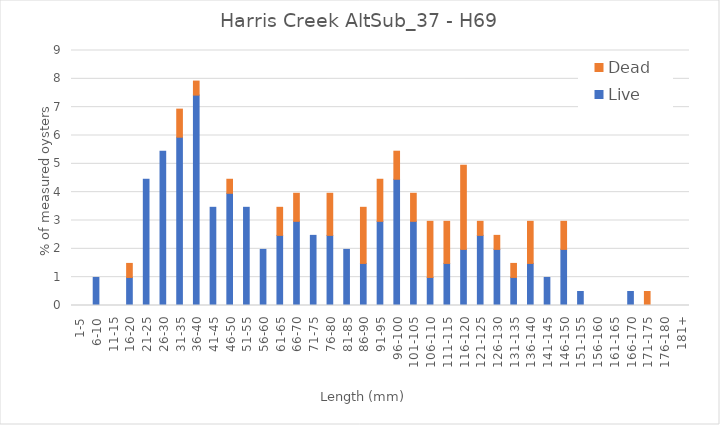
| Category | Live | Dead |
|---|---|---|
| 1-5 | 0 | 0 |
| 6-10 | 0.99 | 0 |
| 11-15 | 0 | 0 |
| 16-20 | 0.99 | 0.495 |
| 21-25 | 4.455 | 0 |
| 26-30 | 5.446 | 0 |
| 31-35 | 5.941 | 0.99 |
| 36-40 | 7.426 | 0.495 |
| 41-45 | 3.465 | 0 |
| 46-50 | 3.96 | 0.495 |
| 51-55 | 3.465 | 0 |
| 56-60 | 1.98 | 0 |
| 61-65 | 2.475 | 0.99 |
| 66-70 | 2.97 | 0.99 |
| 71-75 | 2.475 | 0 |
| 76-80 | 2.475 | 1.485 |
| 81-85 | 1.98 | 0 |
| 86-90 | 1.485 | 1.98 |
| 91-95 | 2.97 | 1.485 |
| 96-100 | 4.455 | 0.99 |
| 101-105 | 2.97 | 0.99 |
| 106-110 | 0.99 | 1.98 |
| 111-115 | 1.485 | 1.485 |
| 116-120 | 1.98 | 2.97 |
| 121-125 | 2.475 | 0.495 |
| 126-130 | 1.98 | 0.495 |
| 131-135 | 0.99 | 0.495 |
| 136-140 | 1.485 | 1.485 |
| 141-145 | 0.99 | 0 |
| 146-150 | 1.98 | 0.99 |
| 151-155 | 0.495 | 0 |
| 156-160 | 0 | 0 |
| 161-165 | 0 | 0 |
| 166-170 | 0.495 | 0 |
| 171-175 | 0 | 0.495 |
| 176-180 | 0 | 0 |
| 181+ | 0 | 0 |